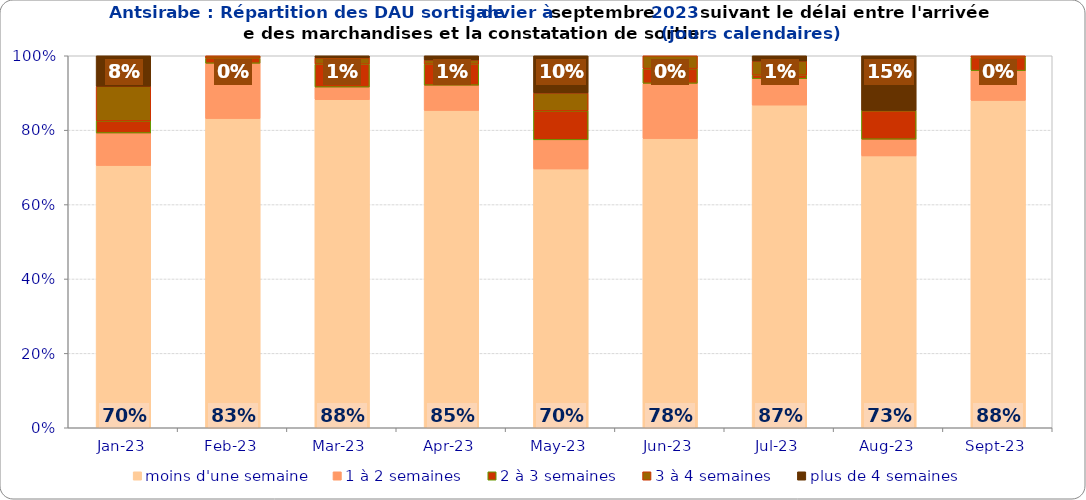
| Category | moins d'une semaine | 1 à 2 semaines | 2 à 3 semaines | 3 à 4 semaines | plus de 4 semaines |
|---|---|---|---|---|---|
| 2023-01-01 | 0.705 | 0.087 | 0.033 | 0.093 | 0.082 |
| 2023-02-01 | 0.831 | 0.149 | 0.014 | 0.007 | 0 |
| 2023-03-01 | 0.882 | 0.034 | 0.062 | 0.017 | 0.006 |
| 2023-04-01 | 0.853 | 0.068 | 0.056 | 0.011 | 0.011 |
| 2023-05-01 | 0.696 | 0.078 | 0.078 | 0.048 | 0.1 |
| 2023-06-01 | 0.777 | 0.149 | 0.04 | 0.035 | 0 |
| 2023-07-01 | 0.867 | 0.071 | 0.009 | 0.038 | 0.014 |
| 2023-08-01 | 0.731 | 0.045 | 0.077 | 0 | 0.147 |
| 2023-09-01 | 0.88 | 0.08 | 0.036 | 0.004 | 0 |